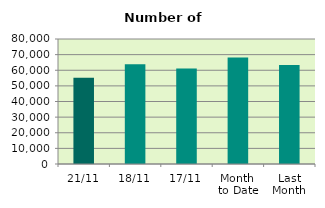
| Category | Series 0 |
|---|---|
| 21/11 | 55248 |
| 18/11 | 63812 |
| 17/11 | 61182 |
| Month 
to Date | 68080.4 |
| Last
Month | 63348.667 |